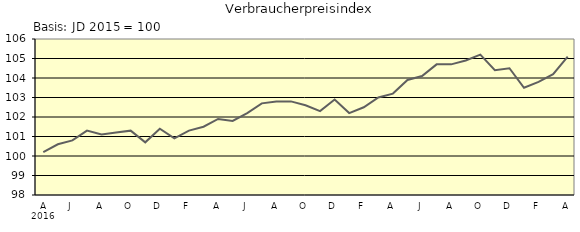
| Category | Series 0 |
|---|---|
| 0 | 100.2 |
| 1 | 100.6 |
| 2 | 100.8 |
| 3 | 101.3 |
| 4 | 101.1 |
| 5 | 101.2 |
| 6 | 101.3 |
| 7 | 100.7 |
| 8 | 101.4 |
| 9 | 100.9 |
| 10 | 101.3 |
| 11 | 101.5 |
| 12 | 101.9 |
| 13 | 101.8 |
| 14 | 102.2 |
| 15 | 102.7 |
| 16 | 102.8 |
| 17 | 102.8 |
| 18 | 102.6 |
| 19 | 102.3 |
| 20 | 102.9 |
| 21 | 102.2 |
| 22 | 102.5 |
| 23 | 103 |
| 24 | 103.2 |
| 25 | 103.9 |
| 26 | 104.1 |
| 27 | 104.7 |
| 28 | 104.7 |
| 29 | 104.9 |
| 30 | 105.2 |
| 31 | 104.4 |
| 32 | 104.5 |
| 33 | 103.5 |
| 34 | 103.8 |
| 35 | 104.2 |
| 36 | 105.1 |